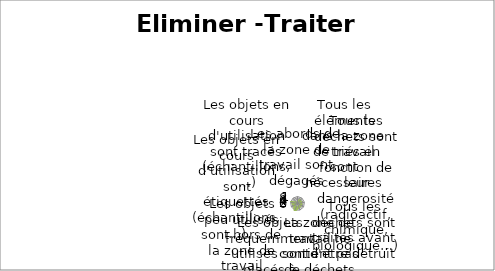
| Category | Series 0 | Series 1 | Series 2 |
|---|---|---|---|
| Les abords de la zone de travail sont dégagés |  |  | 1 |
| Tous les éléments dans la zone de travail sont nécessaires |  |  | 5 |
| Tous les déchets sont triés en fonction de leur dangerosité (radioactif, chimique, biologique…) |  |  | 5 |
| Tous les déchets sont traités avant d'être détruit |  |  | 5 |
| La zone de travail ne contient pas de déchets |  |  | 5 |
| Les objets fréquemment utilisés sont placés à proximités |  |  | 10 |
| Les objets peu utilisés sont hors de la zone de travail |  |  | 5 |
| Les objets en cours d'utilisation sont étiquettés (échantillons,…) |  |  | 7 |
| Les objets en cours d'utilisation sont tracés (échantillons,…) |  |  | 1 |